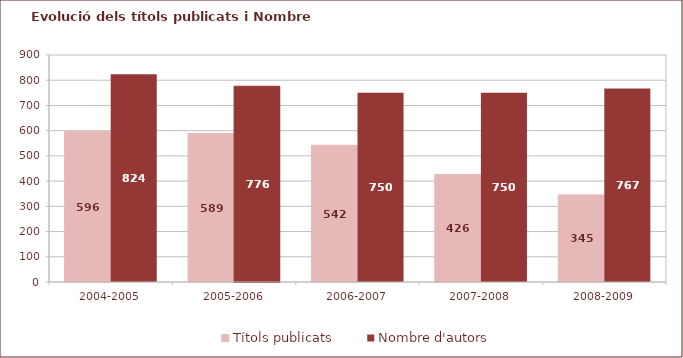
| Category | Títols publicats | Nombre d'autors |
|---|---|---|
| 2004-2005 | 596 | 824 |
| 2005-2006 | 589 | 776 |
| 2006-2007 | 542 | 750 |
| 2007-2008 | 426 | 750 |
| 2008-2009 | 345 | 767 |